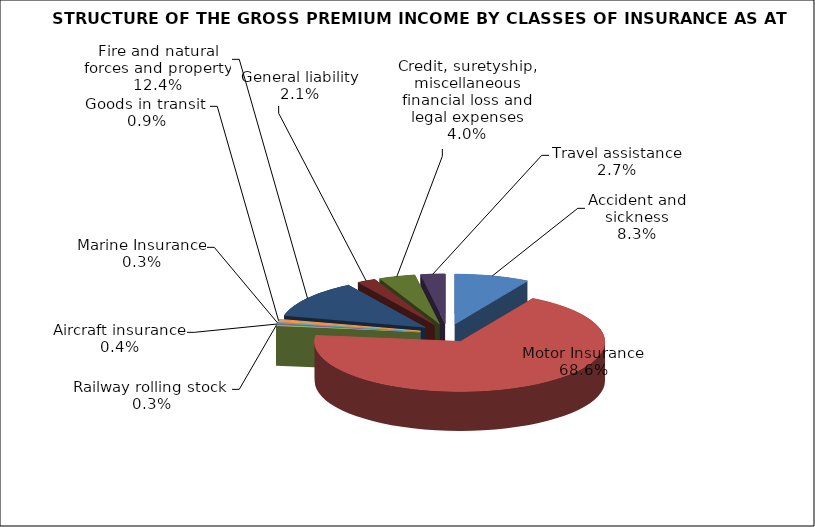
| Category | Accident and sickness |
|---|---|
| Accident and sickness | 0.083 |
| Motor Insurance | 0.686 |
| Railway rolling stock  | 0.003 |
| Aircraft insurance | 0.004 |
| Marine Insurance | 0.003 |
| Goods in transit  | 0.009 |
| Fire and natural forces and property | 0.124 |
| General liability | 0.021 |
| Credit, suretyship, miscellaneous financial loss and legal expenses | 0.04 |
| Travel assistance | 0.027 |